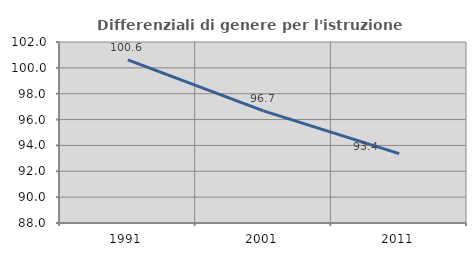
| Category | Differenziali di genere per l'istruzione superiore |
|---|---|
| 1991.0 | 100.62 |
| 2001.0 | 96.678 |
| 2011.0 | 93.361 |